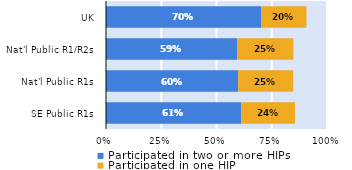
| Category | Participated in two or more HIPs | Participated in one HIP |
|---|---|---|
| SE Public R1s | 0.612 | 0.244 |
| Nat'l Public R1s | 0.598 | 0.249 |
| Nat'l Public R1/R2s | 0.594 | 0.254 |
| UK | 0.702 | 0.205 |